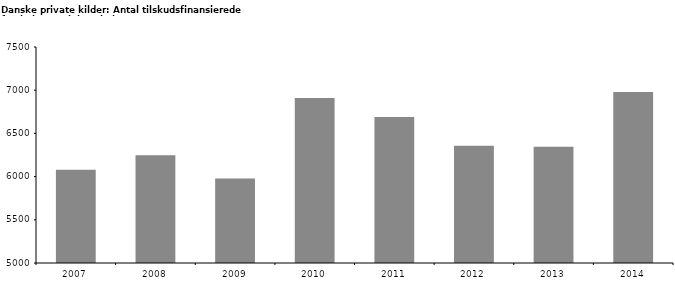
| Category | Danske private kilder |
|---|---|
| 2007.0 | 6078 |
| 2008.0 | 6247.945 |
| 2009.0 | 5978 |
| 2010.0 | 6909 |
| 2011.0 | 6689 |
| 2012.0 | 6356 |
| 2013.0 | 6346 |
| 2014.0 | 6980.351 |